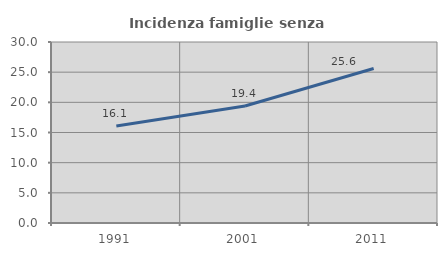
| Category | Incidenza famiglie senza nuclei |
|---|---|
| 1991.0 | 16.067 |
| 2001.0 | 19.383 |
| 2011.0 | 25.617 |